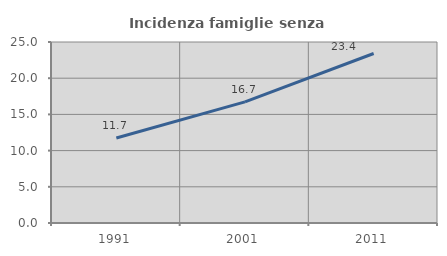
| Category | Incidenza famiglie senza nuclei |
|---|---|
| 1991.0 | 11.737 |
| 2001.0 | 16.724 |
| 2011.0 | 23.41 |